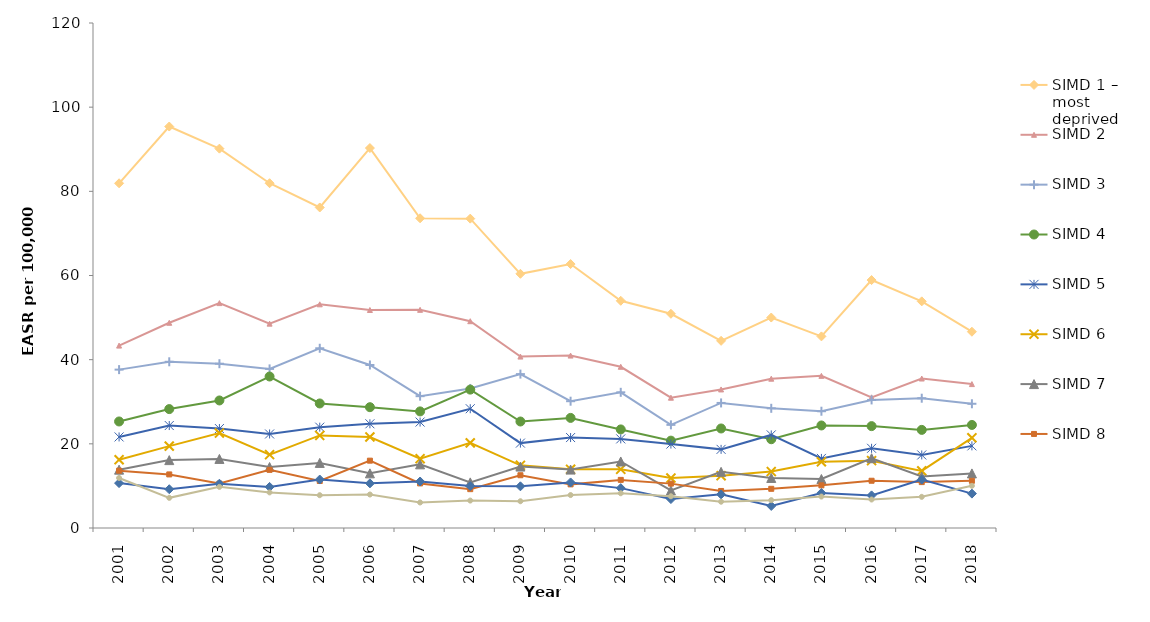
| Category | SIMD 1 – most deprived | SIMD 2 | SIMD 3 | SIMD 4 | SIMD 5 | SIMD 6 | SIMD 7 | SIMD 8 | SIMD 9 | SIMD 10 – least deprived |
|---|---|---|---|---|---|---|---|---|---|---|
| 2001 | 81.91 | 43.342 | 37.633 | 25.313 | 21.639 | 16.22 | 13.865 | 13.622 | 10.667 | 11.892 |
| 2002 | 95.4 | 48.764 | 39.495 | 28.256 | 24.349 | 19.457 | 16.132 | 12.732 | 9.21 | 7.168 |
| 2003 | 90.143 | 53.44 | 39.038 | 30.307 | 23.631 | 22.564 | 16.411 | 10.562 | 10.522 | 9.771 |
| 2004 | 81.929 | 48.564 | 37.806 | 35.996 | 22.343 | 17.443 | 14.49 | 13.813 | 9.762 | 8.46 |
| 2005 | 76.16 | 53.152 | 42.709 | 29.592 | 23.96 | 21.997 | 15.464 | 11.165 | 11.518 | 7.794 |
| 2006 | 90.284 | 51.804 | 38.732 | 28.71 | 24.762 | 21.625 | 12.987 | 16 | 10.608 | 7.957 |
| 2007 | 73.597 | 51.843 | 31.326 | 27.706 | 25.174 | 16.473 | 15.13 | 10.596 | 11.046 | 6.064 |
| 2008 | 73.508 | 49.143 | 33.158 | 32.884 | 28.344 | 20.218 | 10.841 | 9.23 | 9.959 | 6.522 |
| 2009 | 60.402 | 40.737 | 36.569 | 25.306 | 20.175 | 14.9 | 14.6 | 12.536 | 9.905 | 6.362 |
| 2010 | 62.72 | 40.974 | 30.13 | 26.161 | 21.491 | 13.952 | 13.881 | 10.368 | 10.825 | 7.827 |
| 2011 | 53.995 | 38.31 | 32.241 | 23.424 | 21.175 | 13.947 | 15.807 | 11.433 | 9.477 | 8.259 |
| 2012 | 50.902 | 30.963 | 24.509 | 20.758 | 19.944 | 11.866 | 8.935 | 10.545 | 6.875 | 7.545 |
| 2013 | 44.475 | 32.923 | 29.718 | 23.649 | 18.685 | 12.419 | 13.348 | 8.8 | 7.991 | 6.246 |
| 2014 | 50.016 | 35.479 | 28.443 | 21.092 | 22.119 | 13.406 | 11.891 | 9.312 | 5.236 | 6.618 |
| 2015 | 45.534 | 36.155 | 27.749 | 24.365 | 16.535 | 15.729 | 11.64 | 10.133 | 8.317 | 7.47 |
| 2016 | 58.914 | 31.051 | 30.436 | 24.208 | 18.937 | 16.001 | 16.583 | 11.23 | 7.75 | 6.77 |
| 2017 | 53.858 | 35.518 | 30.84 | 23.315 | 17.36 | 13.565 | 12.232 | 10.906 | 11.489 | 7.405 |
| 2018 | 46.64 | 34.198 | 29.52 | 24.489 | 19.518 | 21.428 | 12.971 | 11.208 | 8.169 | 10.023 |